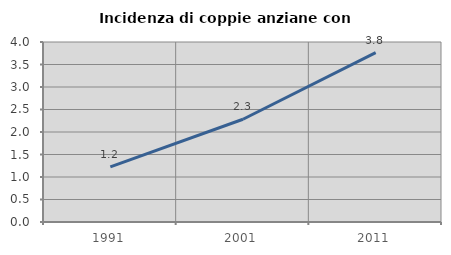
| Category | Incidenza di coppie anziane con figli |
|---|---|
| 1991.0 | 1.224 |
| 2001.0 | 2.283 |
| 2011.0 | 3.763 |